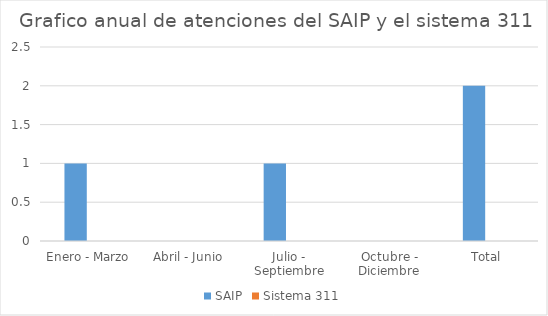
| Category | SAIP | Sistema 311 |
|---|---|---|
| Enero - Marzo | 1 | 0 |
| Abril - Junio | 0 | 0 |
| Julio - Septiembre | 1 | 0 |
| Octubre - Diciembre | 0 | 0 |
| Total | 2 | 0 |